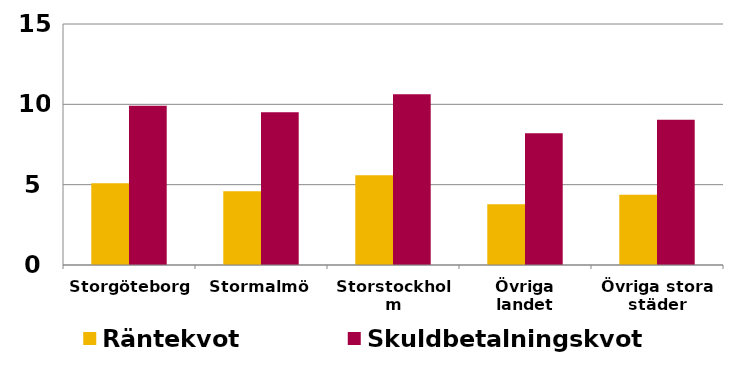
| Category | Räntekvot | Skuldbetalningskvot |
|---|---|---|
| Storgöteborg | 5.089 | 9.91 |
| Stormalmö | 4.592 | 9.512 |
| Storstockholm | 5.579 | 10.634 |
| Övriga landet | 3.787 | 8.194 |
| Övriga stora städer | 4.376 | 9.033 |